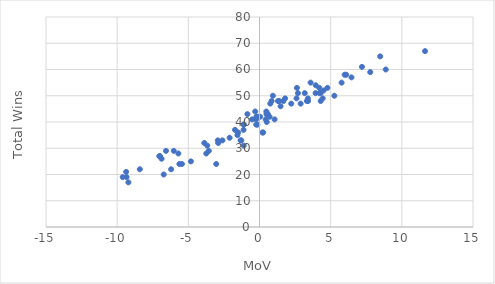
| Category | Series 0 |
|---|---|
| 8.87 | 60 |
| 6.46 | 57 |
| 6.09 | 58 |
| 5.26 | 50 |
| 4.769999999999999 | 53 |
| 4.44 | 49 |
| 4.2 | 53 |
| 3.95 | 54 |
| 3.33 | 48 |
| 3.4 | 49 |
| 2.7 | 51 |
| 1.68 | 48 |
| 0.85 | 48 |
| 0.71 | 42 |
| -0.07 | 42 |
| -0.24 | 41 |
| -0.23 | 39 |
| -1.12 | 39 |
| -1.1 | 39 |
| -1.33 | 33 |
| -1.28 | 33 |
| -1.5 | 36 |
| -1.72 | 37 |
| -2.6 | 33 |
| -2.9 | 32 |
| -6.02 | 29 |
| -8.41 | 22 |
| -9.21 | 17 |
| -9.34 | 19 |
| -9.61 | 19 |
| 8.48 | 65 |
| 7.78 | 59 |
| 5.98 | 58 |
| 4.3 | 48 |
| 4.5 | 52 |
| 3.59 | 55 |
| 3.41 | 48 |
| 2.89 | 47 |
| 2.6 | 49 |
| 2.23 | 47 |
| 1.48 | 46 |
| 1.38 | 48 |
| 1.3 | 48 |
| 0.94 | 50 |
| 0.59 | 43 |
| 0.48 | 44 |
| 0.26 | 36 |
| 0.04 | 42 |
| -0.15 | 39 |
| -0.3 | 44 |
| -1.55 | 35 |
| -3.04 | 24 |
| -3.56 | 29 |
| -3.74 | 28 |
| -4.82 | 25 |
| -5.45 | 24 |
| -6.21 | 22 |
| -7.04 | 27 |
| -6.99 | 27 |
| -9.37 | 21 |
| 11.63 | 67 |
| 7.2 | 61 |
| 5.769999999999999 | 55 |
| 4.21 | 51 |
| 4.29 | 51 |
| 3.94 | 51 |
| 3.18 | 51 |
| 2.63 | 53 |
| 1.8 | 49 |
| 1.06 | 41 |
| 0.76 | 47 |
| 0.49 | 43 |
| 0.51 | 40 |
| 0.43 | 41 |
| 0.2 | 36 |
| -0.22 | 42 |
| -0.18 | 42 |
| -0.52 | 41 |
| -0.85 | 43 |
| -1.12 | 37 |
| -1.11 | 31 |
| -2.1 | 34 |
| -2.93 | 33 |
| -3.67 | 31 |
| -3.88 | 32 |
| -5.63 | 24 |
| -5.7 | 28 |
| -6.73 | 20 |
| -6.57 | 29 |
| -6.88 | 26 |